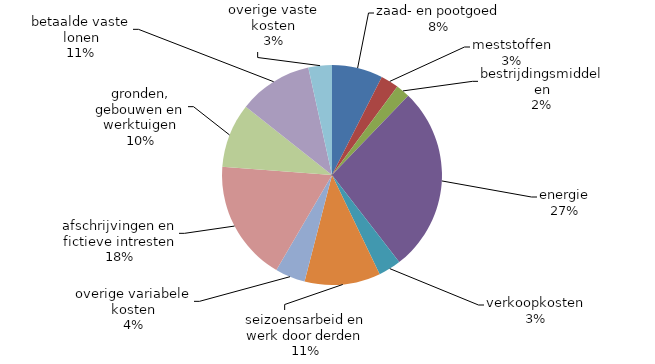
| Category | Series 0 |
|---|---|
| zaad- en pootgoed | 66728.105 |
| meststoffen | 23583.124 |
| bestrijdingsmiddelen | 18309.348 |
| energie | 244096.202 |
| verkoopkosten | 29670.792 |
| seizoensarbeid en werk door derden | 99456.555 |
| overige variabele kosten | 39494.867 |
| afschrijvingen en fictieve intresten | 158348.75 |
| gronden, gebouwen en werktuigen | 84558.507 |
| betaalde vaste lonen | 96965.665 |
| overige vaste kosten | 30851.834 |